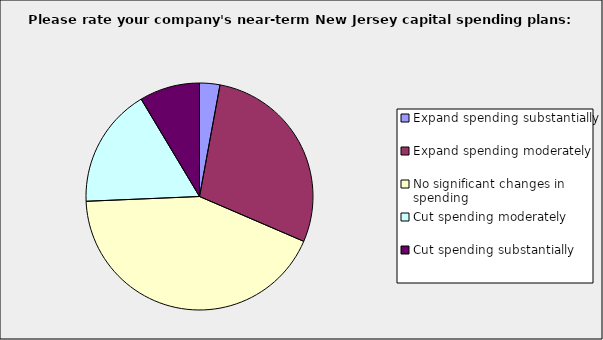
| Category | Series 0 |
|---|---|
| Expand spending substantially | 0.029 |
| Expand spending moderately | 0.286 |
| No significant changes in spending | 0.429 |
| Cut spending moderately | 0.171 |
| Cut spending substantially | 0.086 |